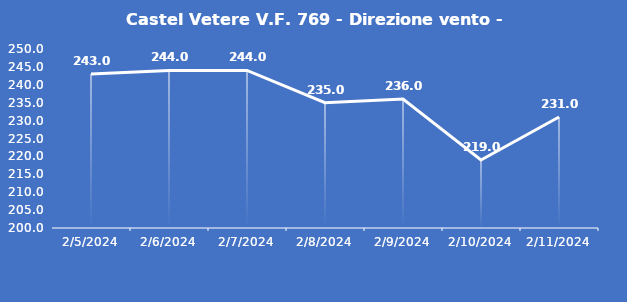
| Category | Castel Vetere V.F. 769 - Direzione vento - Grezzo (°N) |
|---|---|
| 2/5/24 | 243 |
| 2/6/24 | 244 |
| 2/7/24 | 244 |
| 2/8/24 | 235 |
| 2/9/24 | 236 |
| 2/10/24 | 219 |
| 2/11/24 | 231 |